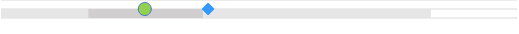
| Category | left | mid start | mid end | right |
|---|---|---|---|---|
| 0 | 0 | 0.203 | 0.267 | 0.53 |